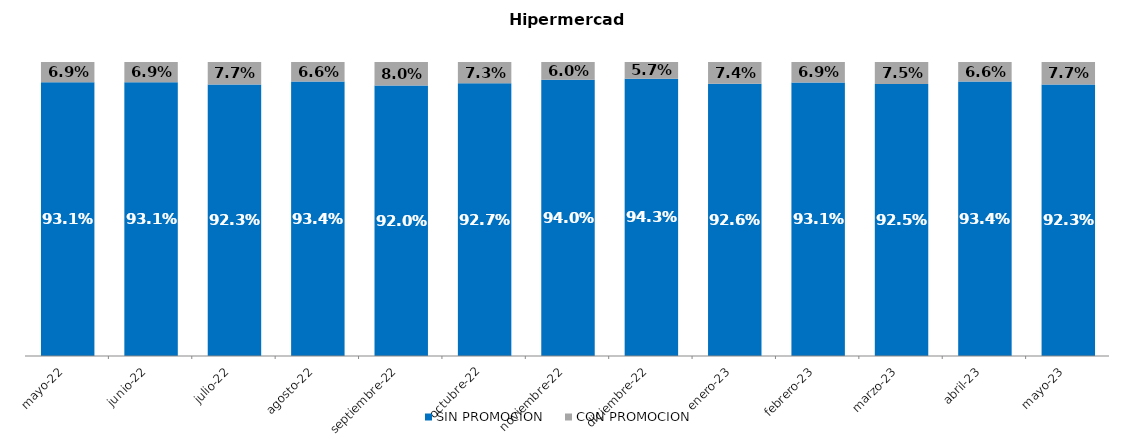
| Category | SIN PROMOCION   | CON PROMOCION   |
|---|---|---|
| 2022-05-01 | 0.931 | 0.069 |
| 2022-06-01 | 0.931 | 0.069 |
| 2022-07-01 | 0.923 | 0.077 |
| 2022-08-01 | 0.934 | 0.066 |
| 2022-09-01 | 0.92 | 0.08 |
| 2022-10-01 | 0.927 | 0.073 |
| 2022-11-01 | 0.94 | 0.06 |
| 2022-12-01 | 0.943 | 0.057 |
| 2023-01-01 | 0.926 | 0.074 |
| 2023-02-01 | 0.931 | 0.069 |
| 2023-03-01 | 0.925 | 0.075 |
| 2023-04-01 | 0.934 | 0.066 |
| 2023-05-01 | 0.923 | 0.077 |